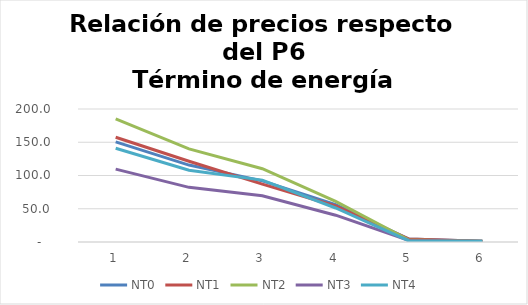
| Category | NT0 | NT1 | NT2 | NT3 | NT4 |
|---|---|---|---|---|---|
| 0 | 150.654 | 157.478 | 185.265 | 109.543 | 140.935 |
| 1 | 115.689 | 121.374 | 140.04 | 82.164 | 107.983 |
| 2 | 91.887 | 86.959 | 110.196 | 69.626 | 93.056 |
| 3 | 56.108 | 54.193 | 60.994 | 40.297 | 51.136 |
| 4 | 4.491 | 4.421 | 2.981 | 2.266 | 1.649 |
| 5 | 1 | 1 | 1 | 1 | 1 |